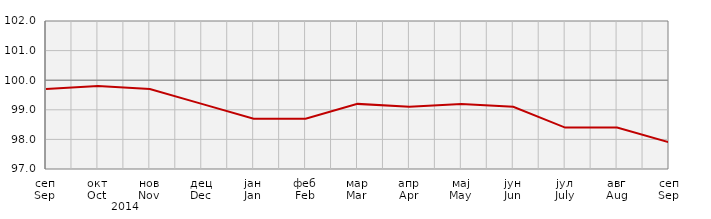
| Category | Series 0 |
|---|---|
| сеп
Sep | 99.7 |
| окт
Oct | 99.8 |
| нов
Nov | 99.7 |
| дец
Dec | 99.2 |
| јан
Jan | 98.7 |
| феб
Feb | 98.7 |
| мар
Mar | 99.2 |
| апр
Apr | 99.1 |
| мај
May | 99.2 |
| јун
Jun | 99.1 |
| јул
July | 98.4 |
| авг
Aug | 98.4 |
| сеп
Sep | 97.9 |